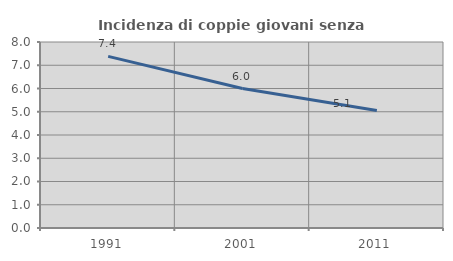
| Category | Incidenza di coppie giovani senza figli |
|---|---|
| 1991.0 | 7.381 |
| 2001.0 | 5.998 |
| 2011.0 | 5.055 |